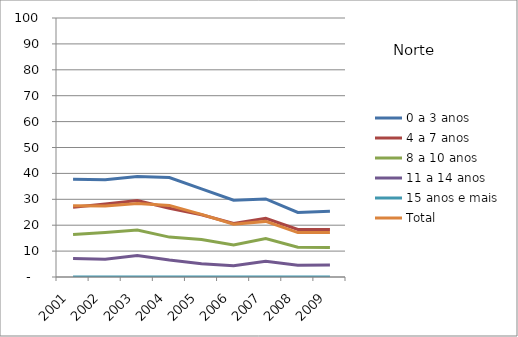
| Category | 0 a 3 anos | 4 a 7 anos | 8 a 10 anos | 11 a 14 anos | 15 anos e mais | Total |
|---|---|---|---|---|---|---|
| 2001.0 | 37.71 | 26.89 | 16.42 | 7.11 | 0 | 27.49 |
| 2002.0 | 37.53 | 28.14 | 17.2 | 6.89 | 0 | 27.44 |
| 2003.0 | 38.79 | 29.54 | 18.18 | 8.29 | 0 | 28.35 |
| 2004.0 | 38.39 | 26.54 | 15.4 | 6.58 | 0 | 27.65 |
| 2005.0 | 34.04 | 24.02 | 14.51 | 5.16 | 0 | 24.18 |
| 2006.0 | 29.66 | 20.66 | 12.41 | 4.31 | 0 | 20.4 |
| 2007.0 | 30.13 | 22.68 | 14.81 | 6.06 | 0 | 21.47 |
| 2008.0 | 24.94 | 18.33 | 11.52 | 4.58 | 0 | 17.14 |
| 2009.0 | 25.34 | 18.38 | 11.37 | 4.65 | 0 | 17.21 |